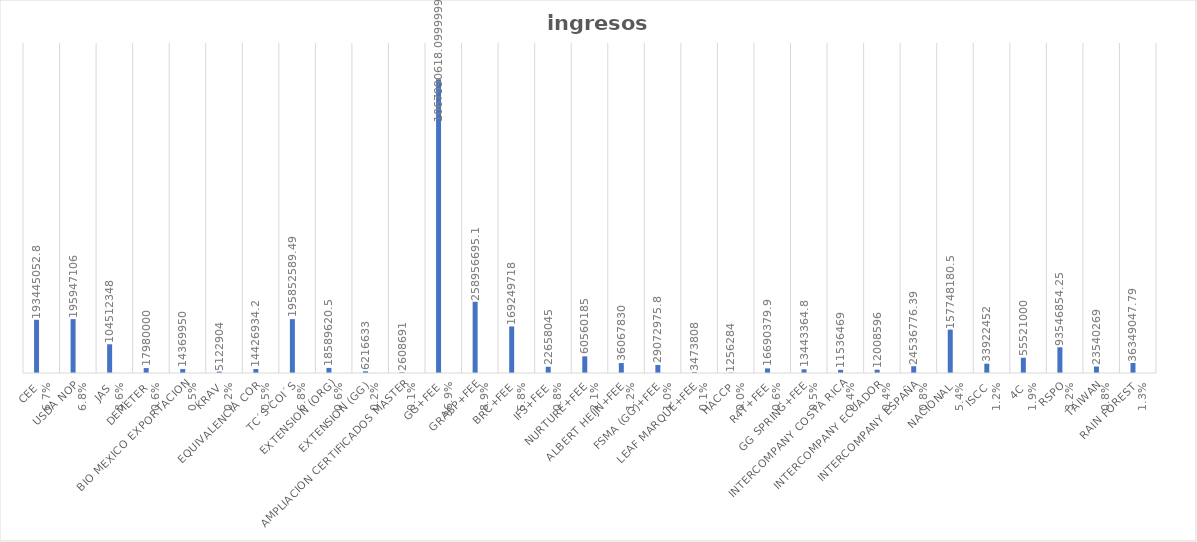
| Category | Series 0 | Series 1 |
|---|---|---|
| CEE |  | 0.067 |
| USDA NOP |  | 0.068 |
| JAS |  | 0.036 |
| DEMETER |  | 0.006 |
| BIO MEXICO EXPORTACION |  | 0.005 |
| KRAV |  | 0.002 |
| EQUIVALENCIA COR |  | 0.005 |
| TC´S COI´S |  | 0.068 |
| EXTENSION (ORG) |  | 0.006 |
| EXTENSION (GG) |  | 0.002 |
| AMPLIACION CERTIFICADOS MASTER |  | 0.001 |
| GG+FEE |  | 0.369 |
| GRASP+FEE |  | 0.089 |
| BRC+FEE |  | 0.058 |
| IFS+FEE |  | 0.008 |
| NURTURE+FEE |  | 0.021 |
| ALBERT HEIJN+FEE |  | 0.012 |
| FSMA (GG)+FEE |  | 0.01 |
| LEAF MARQUE+FEE |  | 0.001 |
| HACCP |  | 0 |
| R4T+FEE |  | 0.006 |
| GG SPRING+FEE |  | 0.005 |
| INTERCOMPANY COSTA RICA |  | 0.004 |
| INTERCOMPANY ECUADOR |  | 0.004 |
| INTERCOMPANY ESPAÑA |  | 0.008 |
| NACIONAL |  | 0.054 |
| ISCC |  | 0.012 |
| 4C |  | 0.019 |
| RSPO |  | 0.032 |
| TAIWAN |  | 0.008 |
| RAIN FOREST |  | 0.013 |